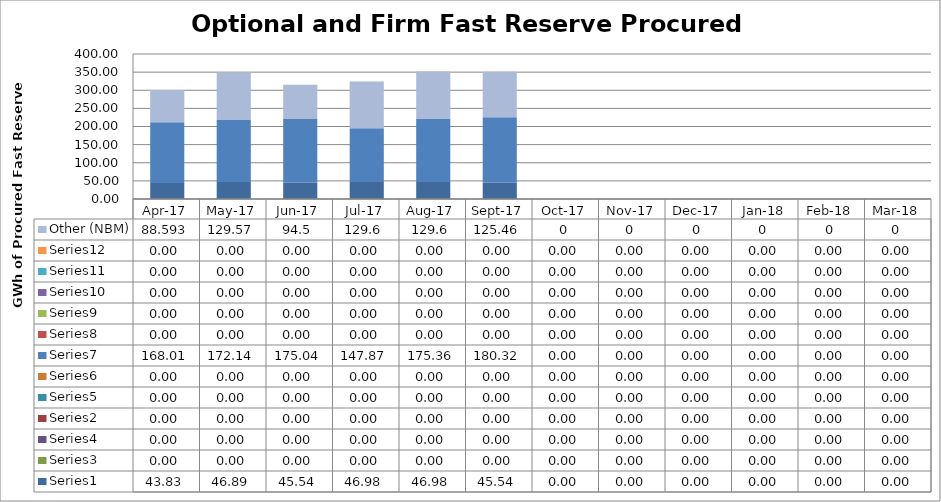
| Category | Series 0 | Series 2 | Series 3 | Series 1 | Series 4 | Series 5 | Series 6 | Series 7 | Series 8 | Series 9 | Series 10 | Series 11 | Other (NBM) |
|---|---|---|---|---|---|---|---|---|---|---|---|---|---|
| 2017-04-01 | 43.83 | 0 | 0 | 0 | 0 | 0 | 168.012 | 0 | 0 | 0 | 0 | 0 | 88.593 |
| 2017-05-01 | 46.89 | 0 | 0 | 0 | 0 | 0 | 172.141 | 0 | 0 | 0 | 0 | 0 | 129.57 |
| 2017-06-01 | 45.54 | 0 | 0 | 0 | 0 | 0 | 175.035 | 0 | 0 | 0 | 0 | 0 | 94.5 |
| 2017-07-01 | 46.98 | 0 | 0 | 0 | 0 | 0 | 147.874 | 0 | 0 | 0 | 0 | 0 | 129.6 |
| 2017-08-01 | 46.98 | 0 | 0 | 0 | 0 | 0 | 175.361 | 0 | 0 | 0 | 0 | 0 | 129.6 |
| 2017-09-01 | 45.54 | 0 | 0 | 0 | 0 | 0 | 180.316 | 0 | 0 | 0 | 0 | 0 | 125.46 |
| 2017-10-01 | 0 | 0 | 0 | 0 | 0 | 0 | 0 | 0 | 0 | 0 | 0 | 0 | 0 |
| 2017-11-01 | 0 | 0 | 0 | 0 | 0 | 0 | 0 | 0 | 0 | 0 | 0 | 0 | 0 |
| 2017-12-01 | 0 | 0 | 0 | 0 | 0 | 0 | 0 | 0 | 0 | 0 | 0 | 0 | 0 |
| 2018-01-01 | 0 | 0 | 0 | 0 | 0 | 0 | 0 | 0 | 0 | 0 | 0 | 0 | 0 |
| 2018-02-01 | 0 | 0 | 0 | 0 | 0 | 0 | 0 | 0 | 0 | 0 | 0 | 0 | 0 |
| 2018-03-01 | 0 | 0 | 0 | 0 | 0 | 0 | 0 | 0 | 0 | 0 | 0 | 0 | 0 |